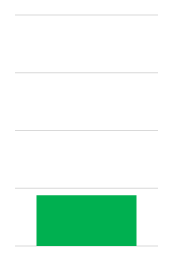
| Category | Series 0 |
|---|---|
| 0 | 0.219 |